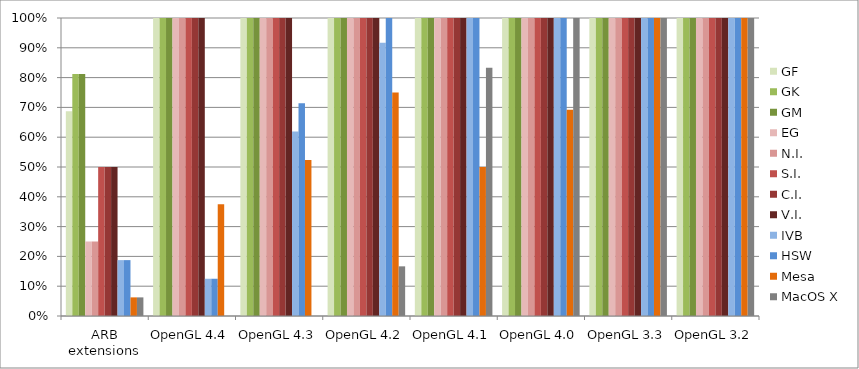
| Category | GF | GK | GM | EG | N.I. | S.I. | C.I. | V.I. | IVB | HSW | Mesa | MacOS X |
|---|---|---|---|---|---|---|---|---|---|---|---|---|
| ARB extensions | 0.688 | 0.812 | 0.812 | 0.25 | 0.25 | 0.5 | 0.5 | 0.5 | 0.188 | 0.188 | 0.062 | 0.062 |
| OpenGL 4.4 | 1 | 1 | 1 | 1 | 1 | 1 | 1 | 1 | 0.125 | 0.125 | 0.375 | 0 |
| OpenGL 4.3 | 1 | 1 | 1 | 1 | 1 | 1 | 1 | 1 | 0.619 | 0.714 | 0.524 | 0 |
| OpenGL 4.2 | 1 | 1 | 1 | 1 | 1 | 1 | 1 | 1 | 0.917 | 1 | 0.75 | 0.167 |
| OpenGL 4.1 | 1 | 1 | 1 | 1 | 1 | 1 | 1 | 1 | 1 | 1 | 0.5 | 0.833 |
| OpenGL 4.0 | 1 | 1 | 1 | 1 | 1 | 1 | 1 | 1 | 1 | 1 | 0.692 | 1 |
| OpenGL 3.3 | 1 | 1 | 1 | 1 | 1 | 1 | 1 | 1 | 1 | 1 | 1 | 1 |
| OpenGL 3.2 | 1 | 1 | 1 | 1 | 1 | 1 | 1 | 1 | 1 | 1 | 1 | 1 |